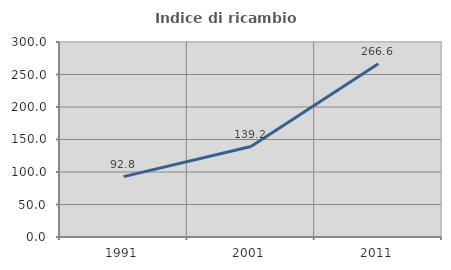
| Category | Indice di ricambio occupazionale  |
|---|---|
| 1991.0 | 92.824 |
| 2001.0 | 139.17 |
| 2011.0 | 266.571 |